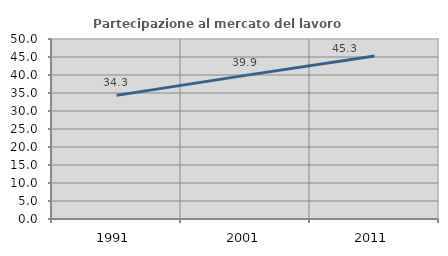
| Category | Partecipazione al mercato del lavoro  femminile |
|---|---|
| 1991.0 | 34.339 |
| 2001.0 | 39.895 |
| 2011.0 | 45.282 |